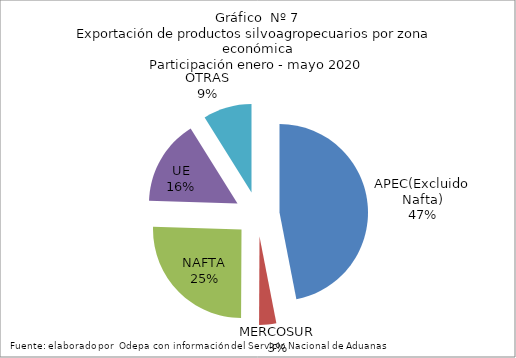
| Category | Series 0 |
|---|---|
| APEC(Excluido Nafta) | 3367655.052 |
| MERCOSUR | 224764.217 |
| NAFTA | 1824309.138 |
| UE | 1119767.439 |
| OTRAS | 637120.153 |